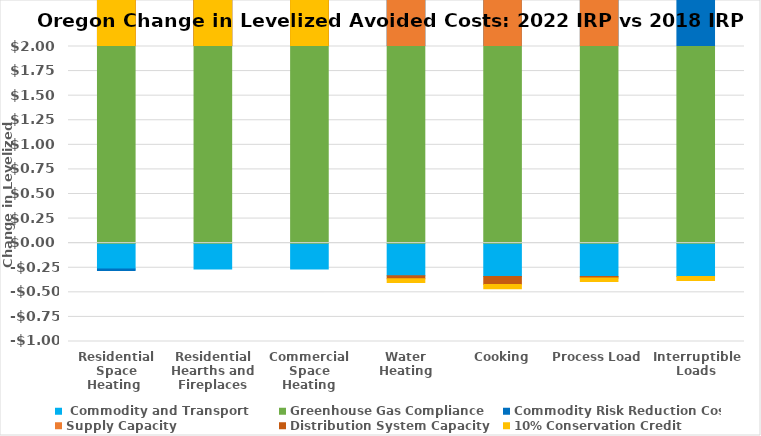
| Category |  Commodity and Transport | Greenhouse Gas Compliance | Commodity Risk Reduction Cost | Supply Capacity | Distribution System Capacity | 10% Conservation Credit |
|---|---|---|---|---|---|---|
| Residential Space Heating  | -0.262 | 2.594 | -0.015 | 0.262 | 0.396 | 0.034 |
| Residential Hearths and Fireplaces | -0.262 | 2.594 | 0.52 | 0.262 | 0.2 | 0.014 |
| Commercial Space Heating | -0.262 | 2.594 | 0.52 | 0.234 | 0.478 | 0.039 |
| Water Heating | -0.332 | 2.594 | 0.52 | 0.036 | -0.029 | -0.038 |
| Cooking | -0.34 | 2.594 | 0.52 | 0.038 | -0.08 | -0.044 |
| Process Load | -0.34 | 2.594 | 0.52 | 0.03 | -0.013 | -0.038 |
| Interruptible Loads | -0.34 | 2.594 | 0.52 | 0 | 0 | -0.04 |